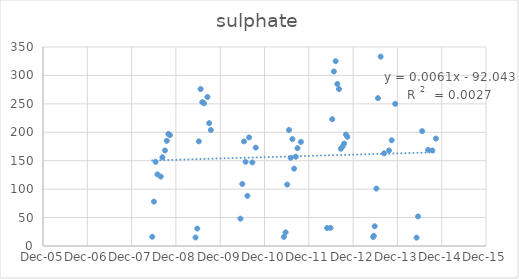
| Category | Series 0 |
|---|---|
| 39590.0 | 16.2 |
| 39604.0 | 78 |
| 39618.0 | 148 |
| 39633.0 | 126 |
| 39660.0 | 122 |
| 39674.0 | 156 |
| 39695.0 | 168 |
| 39710.0 | 185 |
| 39723.0 | 197 |
| 39736.0 | 195 |
| 39947.0 | 15 |
| 39961.0 | 30.7 |
| 39974.0 | 184 |
| 39989.0 | 276 |
| 40002.0 | 253 |
| 40017.0 | 251 |
| 40045.0 | 262 |
| 40059.0 | 216 |
| 40073.0 | 204 |
| 40317.0 | 48.1 |
| 40332.0 | 109 |
| 40346.0 | 184 |
| 40359.0 | 148 |
| 40374.0 | 88.2 |
| 40388.0 | 191 |
| 40415.0 | 147 |
| 40443.0 | 173 |
| 40675.0 | 16 |
| 40689.0 | 24 |
| 40702.0 | 108 |
| 40717.0 | 204 |
| 40731.0 | 155 |
| 40745.0 | 188 |
| 40759.0 | 136 |
| 40773.0 | 157 |
| 40787.0 | 172 |
| 40815.0 | 183 |
| 41031.0 | 31.6 |
| 41059.0 | 31.9 |
| 41073.0 | 223 |
| 41087.0 | 307 |
| 41101.0 | 325 |
| 41115.0 | 285 |
| 41129.0 | 276 |
| 41144.0 | 171 |
| 41158.0 | 175 |
| 41171.0 | 180 |
| 41186.0 | 196 |
| 41198.0 | 192 |
| 41410.0 | 15.8 |
| 41416.0 | 17.8 |
| 41423.0 | 34.7 |
| 41437.0 | 101 |
| 41450.0 | 260 |
| 41472.0 | 333 |
| 41500.0 | 163 |
| 41541.0 | 168 |
| 41563.0 | 186 |
| 41592.0 | 250 |
| 41768.0 | 14.7 |
| 41780.0 | 52 |
| 41814.0 | 202 |
| 41863.0 | 169 |
| 41898.0 | 168 |
| 41927.0 | 189 |